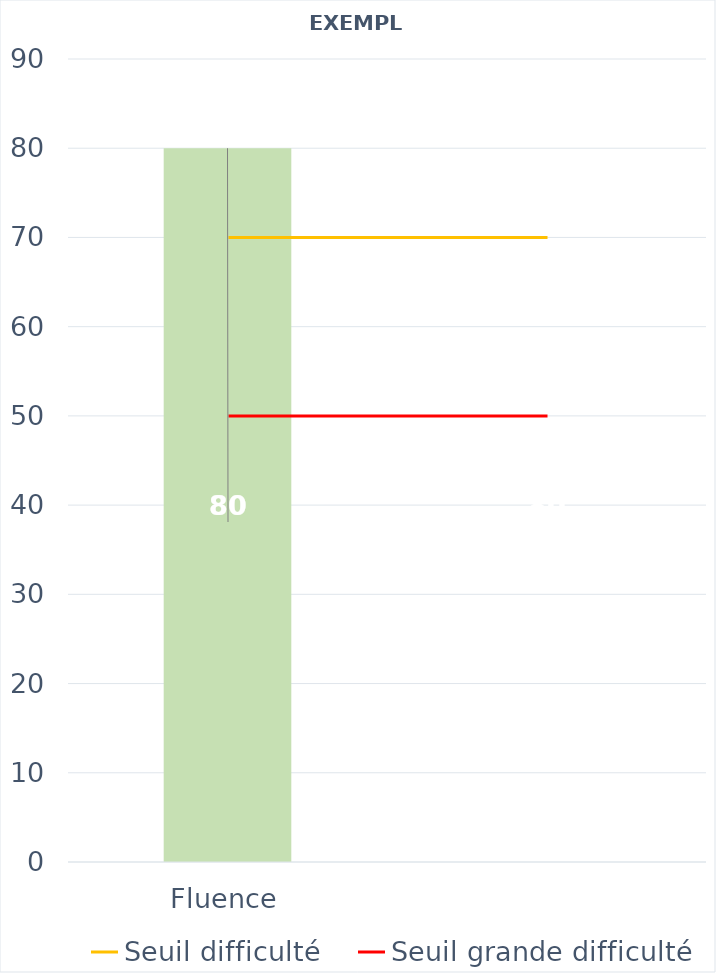
| Category | Résultats élève |
|---|---|
| Fluence | 80 |